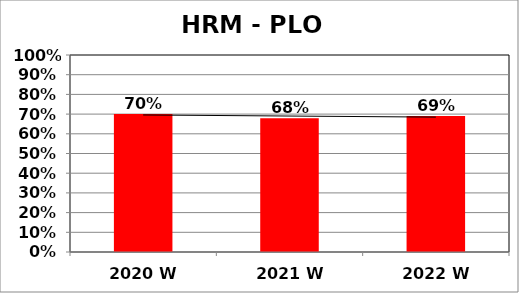
| Category | Series 0 |
|---|---|
| 2020 W | 0.701 |
| 2021 W | 0.68 |
| 2022 W | 0.69 |